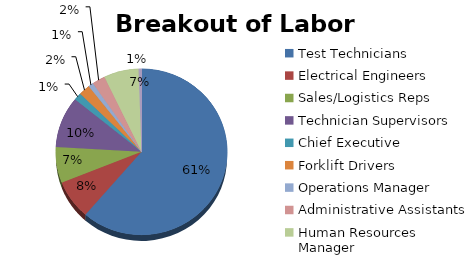
| Category | Series 0 |
|---|---|
| Test Technicians | 7534140 |
| Electrical Engineers | 933800 |
| Sales/Logistics Reps | 856100 |
| Technician Supervisors | 1221150 |
| Chief Executive | 178400 |
| Forklift Drivers | 261280 |
| Operations Manager | 116090 |
| Administrative Assistants | 306000 |
| Human Resources Manager | 806400 |
| Truck Drivers | 66980 |